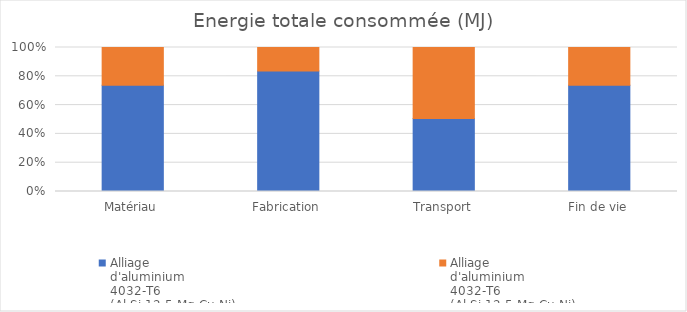
| Category | Alliage
d'aluminium
4032-T6
(Al Si 12,5 Mg Cu Ni)
Biellette initiale | Alliage
d'aluminium
4032-T6
(Al Si 12,5 Mg Cu Ni)
Biellette modifiée |
|---|---|---|
| Matériau | 45 | 16 |
| Fabrication | 2.5 | 0.486 |
| Transport | 0.139 | 0.135 |
| Fin de vie | 0.093 | 0.033 |